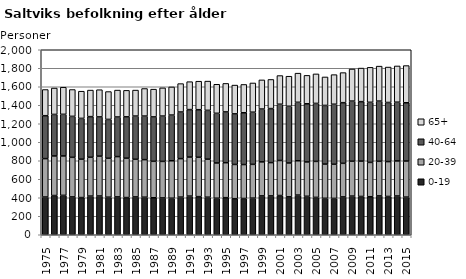
| Category | 0-19 | 20-39 | 40-64 | 65+ |
|---|---|---|---|---|
| 1975.0 | 408 | 415 | 464 | 283 |
| 1976.0 | 424 | 428 | 449 | 285 |
| 1977.0 | 426 | 426 | 450 | 293 |
| 1978.0 | 409 | 428 | 443 | 290 |
| 1979.0 | 402 | 415 | 441 | 294 |
| 1980.0 | 418 | 420 | 439 | 287 |
| 1981.0 | 419 | 431 | 424 | 294 |
| 1982.0 | 406 | 421 | 420 | 301 |
| 1983.0 | 409 | 436 | 428 | 291 |
| 1984.0 | 402 | 426 | 447 | 286 |
| 1985.0 | 409 | 407 | 467 | 281 |
| 1986.0 | 406 | 406 | 471 | 298 |
| 1987.0 | 400 | 394 | 480 | 300 |
| 1988.0 | 398 | 395 | 490 | 305 |
| 1989.0 | 395 | 405 | 494 | 304 |
| 1990.0 | 407 | 416 | 504 | 307 |
| 1991.0 | 418 | 422 | 513 | 302 |
| 1992.0 | 412 | 426 | 514 | 308 |
| 1993.0 | 406 | 411 | 528 | 316 |
| 1994.0 | 395 | 381 | 537 | 314 |
| 1995.0 | 401 | 378 | 549 | 308 |
| 1996.0 | 390 | 370 | 547 | 311 |
| 1997.0 | 392 | 367 | 560 | 306 |
| 1998.0 | 396 | 365 | 564 | 316 |
| 1999.0 | 420 | 368 | 571 | 315 |
| 2000.0 | 420 | 360 | 584 | 315 |
| 2001.0 | 424 | 379 | 608 | 310 |
| 2002.0 | 410 | 366 | 613 | 325 |
| 2003.0 | 429 | 371 | 632 | 315 |
| 2004.0 | 416 | 371 | 629 | 307 |
| 2005.0 | 404 | 389 | 627 | 319 |
| 2006.0 | 394 | 370 | 634 | 308 |
| 2007.0 | 393 | 369 | 649 | 320 |
| 2008.0 | 409 | 363 | 656 | 325 |
| 2009.0 | 418 | 377 | 650 | 347 |
| 2010.0 | 414 | 382 | 643 | 363 |
| 2011.0 | 411 | 371 | 650 | 378 |
| 2012.0 | 420 | 374 | 651 | 378 |
| 2013.0 | 414 | 377 | 639 | 383 |
| 2014.0 | 419 | 379 | 635 | 392 |
| 2015.0 | 407 | 390 | 630 | 402 |